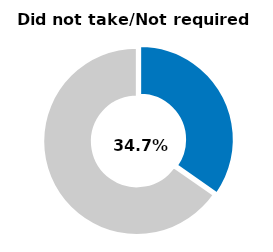
| Category | Series 0 |
|---|---|
| Did not take/not required | 0.347 |
| Other | 0.653 |